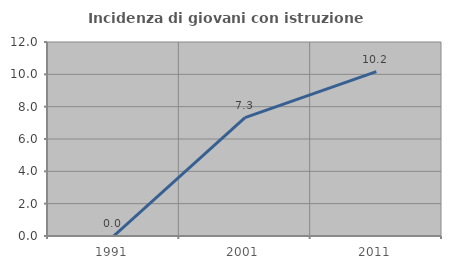
| Category | Incidenza di giovani con istruzione universitaria |
|---|---|
| 1991.0 | 0 |
| 2001.0 | 7.317 |
| 2011.0 | 10.169 |